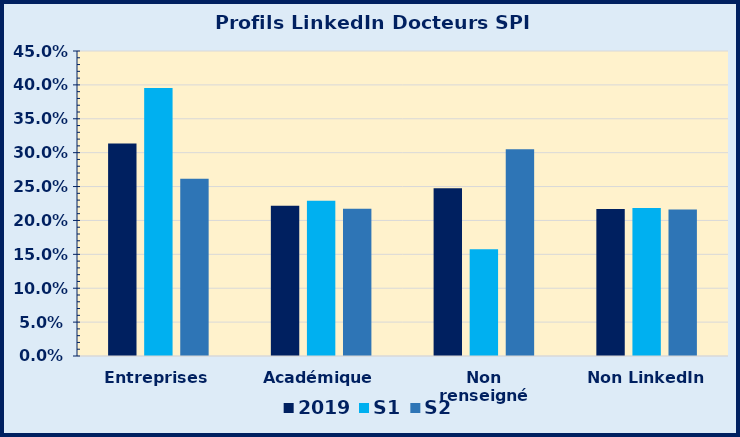
| Category | 2019 | S1 | S2 |
|---|---|---|---|
| Entreprises | 0.314 | 0.395 | 0.262 |
| Académique | 0.222 | 0.229 | 0.217 |
| Non renseigné | 0.248 | 0.157 | 0.305 |
| Non LinkedIn | 0.217 | 0.218 | 0.216 |